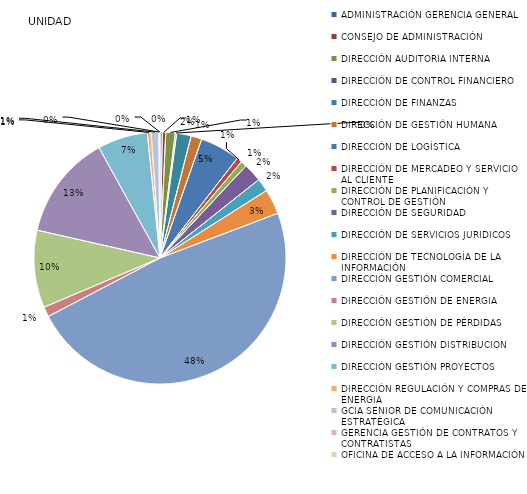
| Category | Series 0 |
|---|---|
| ADMINISTRACIÓN GERENCIA GENERAL | 8 |
| CONSEJO DE ADMINISTRACIÓN | 12 |
| DIRECCIÓN AUDITORIA INTERNA | 33 |
| DIRECCIÓN DE CONTROL FINANCIERO | 5 |
| DIRECCIÓN DE FINANZAS | 51 |
| DIRECCIÓN DE GESTIÓN HUMANA | 38 |
| DIRECCIÓN DE LOGÍSTICA | 140 |
| DIRECCIÓN DE MERCADEO Y SERVICIO AL CLIENTE | 19 |
| DIRECCIÓN DE PLANIFICACIÓN Y CONTROL DE GESTIÓN  | 21 |
| DIRECCIÓN DE SEGURIDAD  | 65 |
| DIRECCIÓN DE SERVICIOS JURIDICOS | 46 |
| DIRECCIÓN DE TECNOLOGÍA DE LA INFORMACIÓN | 88 |
| DIRECCIÓN GESTIÓN COMERCIAL | 1316 |
| DIRECCIÓN GESTIÓN DE ENERGIA  | 35 |
| DIRECCIÓN GESTIÓN DE PÉRDIDAS | 272 |
| DIRECCIÓN GESTIÓN DISTRIBUCION | 367 |
| DIRECCIÓN GESTIÓN PROYECTOS | 176 |
| DIRECCIÓN REGULACIÓN Y COMPRAS DE ENERGIA | 13 |
| GCIA SENIOR DE COMUNICACIÓN ESTRATÉGICA | 27 |
| GERENCIA GESTIÓN DE CONTRATOS Y CONTRATISTAS | 3 |
| OFICINA DE ACCESO A LA INFORMACIÓN | 1 |